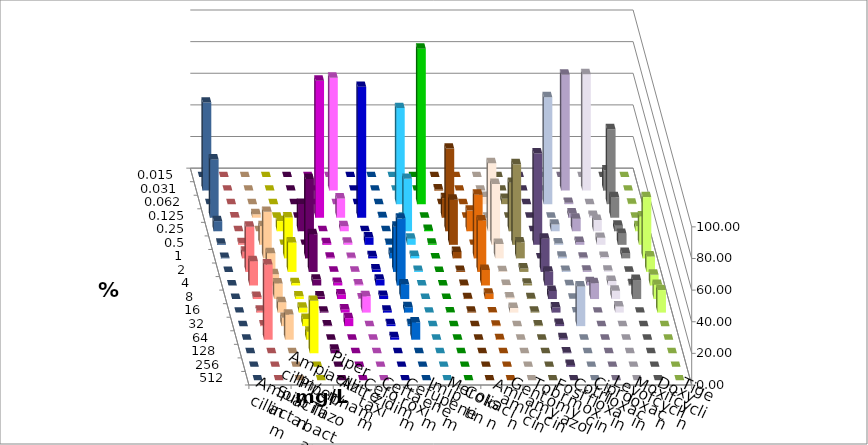
| Category | Ampicillin | Ampicillin/ Sulbactam | Piperacillin | Piperacillin/ Tazobactam | Aztreonam | Cefotaxim | Ceftazidim | Cefuroxim | Imipenem | Meropenem | Colistin | Amikacin | Gentamicin | Tobramycin | Fosfomycin | Cotrimoxazol | Ciprofloxacin | Levofloxacin | Moxifloxacin | Doxycyclin | Tigecyclin |
|---|---|---|---|---|---|---|---|---|---|---|---|---|---|---|---|---|---|---|---|---|---|
| 0.015 | 0 | 0 | 0 | 0 | 0 | 0 | 0 | 0 | 0 | 0 | 0 | 0 | 0 | 0 | 0 | 0 | 0 | 0 | 0 | 0 | 0 |
| 0.031 | 0 | 0 | 0 | 0 | 0 | 71.404 | 0 | 0 | 0 | 0 | 0.679 | 0 | 0 | 0 | 0 | 0 | 73.266 | 73.604 | 12.69 | 0 | 55.668 |
| 0.062 | 0 | 0 | 0 | 0 | 0 | 0 | 0 | 0 | 60.745 | 98.308 | 0 | 0 | 4.576 | 3.384 | 0 | 67.627 | 0.846 | 0 | 47.377 | 0.338 | 0 |
| 0.125 | 0.169 | 2.2 | 0 | 0 | 86.633 | 12.183 | 82.741 | 0.338 | 0 | 0 | 12.394 | 0 | 0 | 0 | 0 | 0 | 2.707 | 1.184 | 13.029 | 0 | 36.887 |
| 0.25 | 0 | 0 | 6.43 | 17.259 | 0 | 3.215 | 0 | 0 | 33.164 | 0.846 | 52.292 | 13.073 | 43.051 | 30.626 | 0 | 4.237 | 7.953 | 7.107 | 3.553 | 3.215 | 6.43 |
| 0.5 | 1.015 | 11.844 | 0 | 0 | 1.015 | 1.354 | 4.738 | 0.508 | 3.892 | 0.677 | 28.523 | 0 | 38.475 | 50.931 | 57.797 | 0.847 | 1.861 | 4.399 | 6.937 | 17.936 | 0.677 |
| 1.0 | 4.23 | 29.442 | 25.888 | 50.254 | 0.508 | 0.338 | 1.354 | 3.384 | 1.523 | 0 | 4.075 | 40.238 | 9.153 | 10.152 | 0 | 1.017 | 0.508 | 0.846 | 3.384 | 38.748 | 0.338 |
| 2.0 | 28.596 | 11.844 | 18.613 | 23.858 | 0.169 | 0.169 | 1.523 | 28.596 | 0.677 | 0 | 0.679 | 32.598 | 0.508 | 2.2 | 21.017 | 0.678 | 0.846 | 0.846 | 0.169 | 9.814 | 0 |
| 4.0 | 15.398 | 7.107 | 1.523 | 3.723 | 1.692 | 0.677 | 3.723 | 42.301 | 0 | 0 | 0.34 | 9.847 | 0.339 | 1.184 | 8.814 | 0.169 | 2.03 | 2.876 | 0.846 | 6.768 | 0 |
| 8.0 | 1.354 | 9.814 | 1.692 | 1.692 | 2.876 | 0.338 | 2.03 | 9.306 | 0 | 0 | 0.509 | 3.396 | 1.017 | 0.508 | 5.085 | 0.169 | 9.983 | 5.245 | 12.014 | 8.968 | 0 |
| 16.0 | 1.184 | 6.599 | 3.046 | 0.508 | 2.03 | 10.321 | 1.184 | 3.384 | 0 | 0.169 | 0.509 | 0.17 | 2.881 | 0.508 | 3.22 | 0.169 | 0 | 3.892 | 0 | 14.213 | 0 |
| 32.0 | 0.508 | 5.245 | 4.569 | 0.508 | 5.076 | 0 | 1.184 | 1.184 | 0 | 0 | 0 | 0.34 | 0 | 0.508 | 1.356 | 25.085 | 0 | 0 | 0 | 0 | 0 |
| 64.0 | 47.547 | 15.905 | 5.076 | 0 | 0 | 0 | 1.523 | 10.998 | 0 | 0 | 0 | 0.34 | 0 | 0 | 1.017 | 0 | 0 | 0 | 0 | 0 | 0 |
| 128.0 | 0 | 0 | 33.164 | 2.2 | 0 | 0 | 0 | 0 | 0 | 0 | 0 | 0 | 0 | 0 | 0.508 | 0 | 0 | 0 | 0 | 0 | 0 |
| 256.0 | 0 | 0 | 0 | 0 | 0 | 0 | 0 | 0 | 0 | 0 | 0 | 0 | 0 | 0 | 1.186 | 0 | 0 | 0 | 0 | 0 | 0 |
| 512.0 | 0 | 0 | 0 | 0 | 0 | 0 | 0 | 0 | 0 | 0 | 0 | 0 | 0 | 0 | 0 | 0 | 0 | 0 | 0 | 0 | 0 |